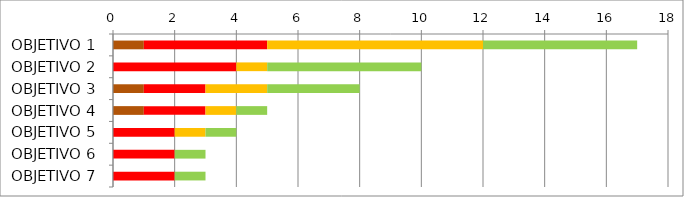
| Category | Series 0 | Series 1 | Series 2 | Series 3 | Series 4 | Series 5 |
|---|---|---|---|---|---|---|
| OBJETIVO 1 | 1 | 0 | 4 | 7 | 5 | 0 |
| OBJETIVO 2 | 0 | 0 | 4 | 1 | 5 | 0 |
| OBJETIVO 3 | 1 | 0 | 2 | 2 | 3 | 0 |
| OBJETIVO 4 | 1 | 0 | 2 | 1 | 1 | 0 |
| OBJETIVO 5 | 0 | 0 | 2 | 1 | 1 | 0 |
| OBJETIVO 6 | 0 | 0 | 2 | 0 | 1 | 0 |
| OBJETIVO 7 | 0 | 0 | 2 | 0 | 1 | 0 |